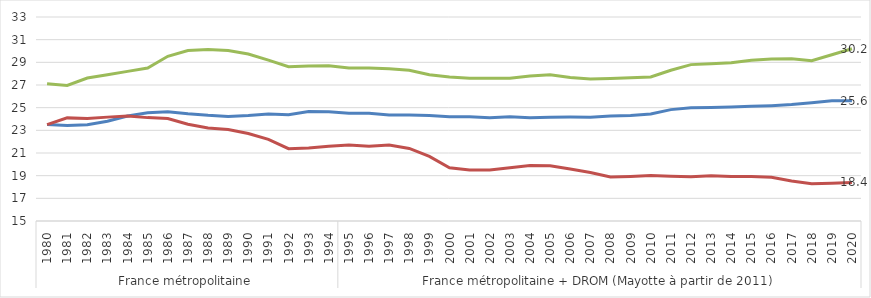
| Category | Formation en collège (1) | Formation pro en lycée | Formation GT en lycée |
|---|---|---|---|
| 0 | 23.523 | 23.5 | 27.1 |
| 1 | 23.423 | 24.099 | 26.961 |
| 2 | 23.485 | 24.043 | 27.62 |
| 3 | 23.805 | 24.165 | 27.908 |
| 4 | 24.267 | 24.266 | 28.202 |
| 5 | 24.546 | 24.121 | 28.5 |
| 6 | 24.644 | 24.044 | 29.532 |
| 7 | 24.462 | 23.532 | 30.038 |
| 8 | 24.321 | 23.21 | 30.138 |
| 9 | 24.221 | 23.066 | 30.038 |
| 10 | 24.3 | 22.721 | 29.732 |
| 11 | 24.441 | 22.199 | 29.196 |
| 12 | 24.382 | 21.377 | 28.62 |
| 13 | 24.662 | 21.444 | 28.667 |
| 14 | 24.641 | 21.589 | 28.708 |
| 15 | 24.5 | 21.7 | 28.5 |
| 16 | 24.5 | 21.6 | 28.5 |
| 17 | 24.362 | 21.7 | 28.431 |
| 18 | 24.362 | 21.4 | 28.3 |
| 19 | 24.3 | 20.7 | 27.9 |
| 20 | 24.2 | 19.7 | 27.7 |
| 21 | 24.2 | 19.5 | 27.6 |
| 22 | 24.1 | 19.5 | 27.6 |
| 23 | 24.2 | 19.7 | 27.6 |
| 24 | 24.1 | 19.9 | 27.8 |
| 25 | 24.155 | 19.867 | 27.907 |
| 26 | 24.166 | 19.581 | 27.664 |
| 27 | 24.145 | 19.276 | 27.532 |
| 28 | 24.274 | 18.886 | 27.575 |
| 29 | 24.307 | 18.931 | 27.632 |
| 30 | 24.438 | 19.007 | 27.705 |
| 31 | 24.828 | 18.944 | 28.297 |
| 32 | 24.998 | 18.899 | 28.798 |
| 33 | 25.017 | 18.988 | 28.886 |
| 34 | 25.053 | 18.932 | 28.962 |
| 35 | 25.12 | 18.928 | 29.19 |
| 36 | 25.175 | 18.864 | 29.297 |
| 37 | 25.27 | 18.533 | 29.319 |
| 38 | 25.433 | 18.297 | 29.138 |
| 39 | 25.601 | 18.332 | 29.664 |
| 40 | 25.6 | 18.4 | 30.2 |